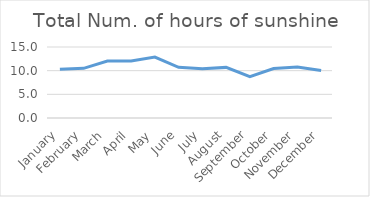
| Category | Series 0 |
|---|---|
| January | 10.302 |
| February | 10.488 |
| March | 12.018 |
| April | 12.052 |
| May | 12.866 |
| June | 10.708 |
| July | 10.404 |
| August | 10.694 |
| September | 8.732 |
| October | 10.461 |
| November | 10.784 |
| December | 10.018 |